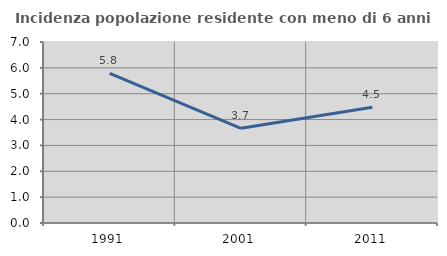
| Category | Incidenza popolazione residente con meno di 6 anni |
|---|---|
| 1991.0 | 5.788 |
| 2001.0 | 3.663 |
| 2011.0 | 4.473 |